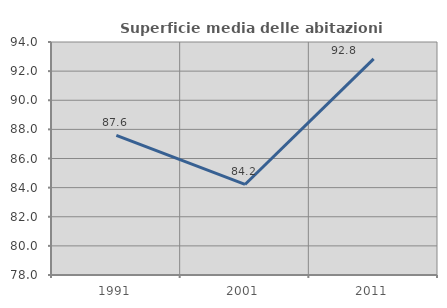
| Category | Superficie media delle abitazioni occupate |
|---|---|
| 1991.0 | 87.587 |
| 2001.0 | 84.218 |
| 2011.0 | 92.842 |